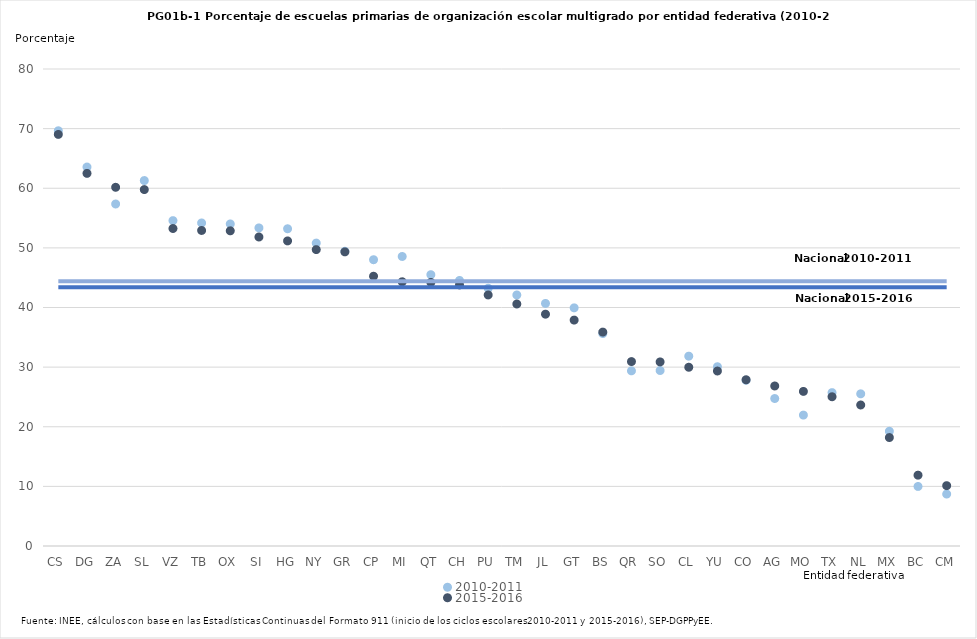
| Category | 2010-2011 | 2015-2016 | Series 2 | Series 3 |
|---|---|---|---|---|
| CS | 69.639 | 69.03 | 44.418 | 43.379 |
| DG | 63.556 | 62.495 | 44.418 | 43.379 |
| ZA | 57.361 | 60.16 | 44.418 | 43.379 |
| SL | 61.291 | 59.776 | 44.418 | 43.379 |
| VZ | 54.571 | 53.248 | 44.418 | 43.379 |
| TB | 54.178 | 52.922 | 44.418 | 43.379 |
| OX | 54.011 | 52.862 | 44.418 | 43.379 |
| SI | 53.35 | 51.826 | 44.418 | 43.379 |
| HG | 53.205 | 51.168 | 44.418 | 43.379 |
| NY | 50.803 | 49.708 | 44.418 | 43.379 |
| GR | 49.431 | 49.329 | 44.418 | 43.379 |
| CP | 48.015 | 45.244 | 44.418 | 43.379 |
| MI | 48.558 | 44.313 | 44.418 | 43.379 |
| QT | 45.503 | 44.209 | 44.418 | 43.379 |
| CH | 44.538 | 43.79 | 44.418 | 43.379 |
| PU | 43.227 | 42.106 | 44.418 | 43.379 |
| TM | 42.101 | 40.586 | 44.418 | 43.379 |
| JL | 40.683 | 38.88 | 44.418 | 43.379 |
| GT | 39.94 | 37.888 | 44.418 | 43.379 |
| BS | 35.632 | 35.874 | 44.418 | 43.379 |
| QR | 29.376 | 30.93 | 44.418 | 43.379 |
| SO | 29.431 | 30.875 | 44.418 | 43.379 |
| CL | 31.837 | 29.98 | 44.418 | 43.379 |
| YU | 30.065 | 29.349 | 44.418 | 43.379 |
| CO | 27.792 | 27.88 | 44.418 | 43.379 |
| AG | 24.734 | 26.836 | 44.418 | 43.379 |
| MO | 21.953 | 25.929 | 44.418 | 43.379 |
| TX | 25.725 | 25.031 | 44.418 | 43.379 |
| NL | 25.52 | 23.65 | 44.418 | 43.379 |
| MX | 19.243 | 18.188 | 44.418 | 43.379 |
| BC | 9.988 | 11.879 | 44.418 | 43.379 |
| CM | 8.712 | 10.122 | 44.418 | 43.379 |